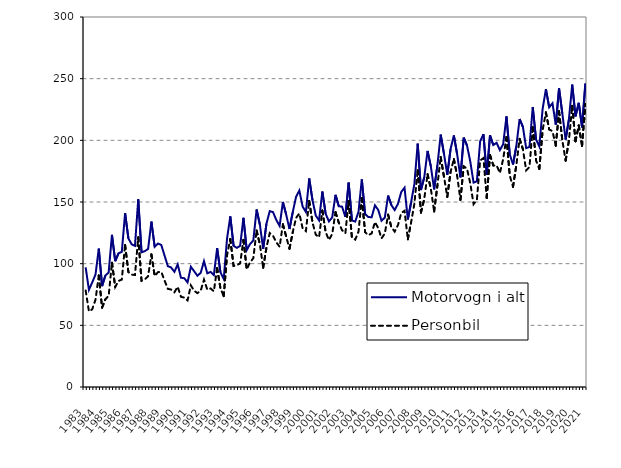
| Category | Motorvogn i alt | Personbil |
|---|---|---|
| 1983.0 | 97 | 78.3 |
| nan | 78.8 | 61.3 |
| nan | 84.8 | 63 |
| nan | 91.2 | 70.8 |
| 1984.0 | 112.2 | 90.4 |
| nan | 81.8 | 64.4 |
| nan | 90.4 | 71.1 |
| nan | 92.9 | 73.9 |
| 1985.0 | 123.4 | 100.8 |
| nan | 102 | 81.1 |
| nan | 108.4 | 86 |
| nan | 109.6 | 87.1 |
| 1986.0 | 141 | 115.2 |
| nan | 120.5 | 93.2 |
| nan | 115.7 | 91.1 |
| nan | 114.4 | 90.8 |
| 1987.0 | 152.2 | 121.3 |
| nan | 109.2 | 86.1 |
| nan | 110.1 | 87.3 |
| nan | 112 | 89.8 |
| 1988.0 | 134.1 | 107.5 |
| nan | 113.7 | 90 |
| nan | 116.3 | 93.1 |
| nan | 115.2 | 93.4 |
| 1989.0 | 106.6 | 86.4 |
| nan | 98 | 79.6 |
| nan | 96.9 | 79 |
| nan | 93.4 | 76.8 |
| 1990.0 | 99.4 | 81.3 |
| nan | 88.6 | 73.1 |
| nan | 88.2 | 72.5 |
| nan | 84.8 | 70.2 |
| 1991.0 | 97.5 | 82.4 |
| nan | 93.9 | 78 |
| nan | 90.2 | 76.1 |
| nan | 92.6 | 78.1 |
| 1992.0 | 102 | 87.1 |
| nan | 92.2 | 78.9 |
| nan | 93.3 | 79.9 |
| nan | 90.8 | 77.6 |
| 1993.0 | 112.6 | 96.5 |
| nan | 93 | 80.1 |
| nan | 87.5 | 73.6 |
| nan | 120.1 | 106.6 |
| 1994.0 | 138.4 | 120 |
| nan | 114.5 | 98.1 |
| nan | 112.8 | 98.8 |
| nan | 114.5 | 100.2 |
| 1995.0 | 137.2 | 119.3 |
| nan | 111 | 95.4 |
| nan | 115.9 | 101 |
| nan | 118.8 | 104.4 |
| 1996.0 | 143.9 | 126.9 |
| nan | 131.6 | 115.7 |
| nan | 112 | 96.7 |
| nan | 132.5 | 113.1 |
| 1997.0 | 142.6 | 124.8 |
| nan | 141.8 | 122.5 |
| nan | 135.4 | 117.3 |
| nan | 130.6 | 113.7 |
| 1998.0 | 150 | 131.9 |
| nan | 139.8 | 122 |
| nan | 128.1 | 112.1 |
| nan | 141.8 | 125.6 |
| 1999.0 | 154.2 | 137.1 |
| nan | 159.3 | 140.7 |
| nan | 146.3 | 128.7 |
| nan | 141.9 | 126.4 |
| 2000.0 | 169.1 | 150.9 |
| nan | 151.5 | 133.4 |
| nan | 139 | 123.5 |
| nan | 135.1 | 121.4 |
| 2001.0 | 158.5 | 143.1 |
| nan | 140.46 | 125.7 |
| nan | 134.24 | 119.2 |
| nan | 137.495 | 124.072 |
| 2002.0 | 155.814 | 141.724 |
| nan | 146.543 | 133.19 |
| nan | 146.231 | 127.141 |
| nan | 137.967 | 124.641 |
| 2003.0 | 165.679 | 150.811 |
| nan | 135.021 | 121.101 |
| nan | 134.111 | 119.491 |
| nan | 142.013 | 125.959 |
| 2004.0 | 168.309 | 153.043 |
| nan | 140.267 | 125.568 |
| nan | 137.77 | 123.121 |
| nan | 137.685 | 124.506 |
| 2005.0 | 147.311 | 133.756 |
| nan | 143.517 | 128.79 |
| nan | 134.783 | 120.571 |
| nan | 137.37 | 124.382 |
| 2006.0 | 155.213 | 139.728 |
| nan | 147.444 | 129.572 |
| nan | 143.451 | 126.006 |
| nan | 148.561 | 131.195 |
| 2007.0 | 158.1 | 141.084 |
| nan | 161.613 | 142.897 |
| nan | 135.821 | 119.753 |
| nan | 149.791 | 133.498 |
| 2008.0 | 164.642 | 148.614 |
| nan | 197.287 | 175.714 |
| nan | 159.718 | 141.407 |
| nan | 170.057 | 152.54 |
| 2009.0 | 191.38 | 172.559 |
| nan | 178.906 | 160.765 |
| nan | 160.234 | 142.312 |
| nan | 179.857 | 163.532 |
| 2010.0 | 204.636 | 186.507 |
| nan | 188.957 | 170.463 |
| nan | 172.077 | 154.156 |
| nan | 192.961 | 174.399 |
| 2011.0 | 204.005 | 184.86 |
| nan | 188.741 | 171.333 |
| nan | 169.934 | 151.694 |
| nan | 202.176 | 178.919 |
| 2012.0 | 195.829 | 177.072 |
| nan | 182.751 | 165.128 |
| nan | 165.73 | 148.242 |
| nan | 166.805 | 151.728 |
| 2013.0 | 199.181 | 183.653 |
| nan | 205.015 | 185.634 |
| nan | 172.044 | 153.21 |
| nan | 204.1 | 188.079 |
| 2014.0 | 196.177 | 179.552 |
| nan | 197.965 | 179.767 |
| nan | 192.105 | 173.474 |
| nan | 196.809 | 184.739 |
| 2015.0 | 219.419 | 202.592 |
| nan | 188.696 | 171.451 |
| nan | 180.388 | 162.297 |
| nan | 195.23 | 179.891 |
| 2016.0 | 217.298 | 201.197 |
| nan | 210.949 | 192.893 |
| nan | 193.648 | 175.642 |
| nan | 194.663 | 178.455 |
| 2017.0 | 227.029 | 210.738 |
| nan | 200.767 | 183.708 |
| nan | 195.059 | 176.766 |
| nan | 225.423 | 208.218 |
| 2018.0 | 241.528 | 222.678 |
| nan | 226.771 | 208.839 |
| nan | 230.044 | 207.395 |
| nan | 212.667 | 195.666 |
| 2019.0 | 242.056 | 223.584 |
| nan | 221.711 | 199.972 |
| nan | 200.668 | 183.518 |
| nan | 216.92 | 199.72 |
| 2020.0 | 245.163 | 227.947 |
| nan | 219.434 | 199.239 |
| nan | 230.409 | 212.039 |
| nan | 210.538 | 195.423 |
| 2021.0 | 246.037 | 229.482 |